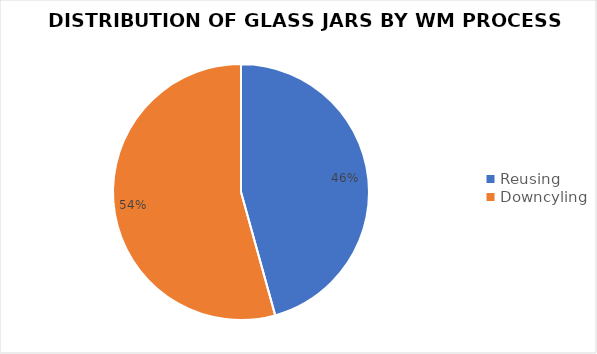
| Category | Series 0 |
|---|---|
| Reusing  | 292 |
| Downcyling | 347 |